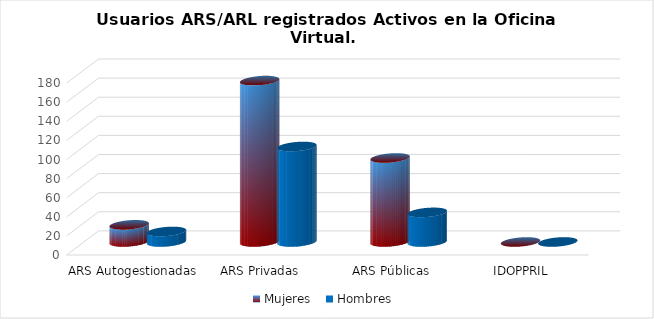
| Category | Mujeres | Hombres |
|---|---|---|
| ARS Autogestionadas | 18 | 11 |
| ARS Privadas | 169 | 100 |
| ARS Públicas | 88 | 31 |
| IDOPPRIL | 0 | 0 |